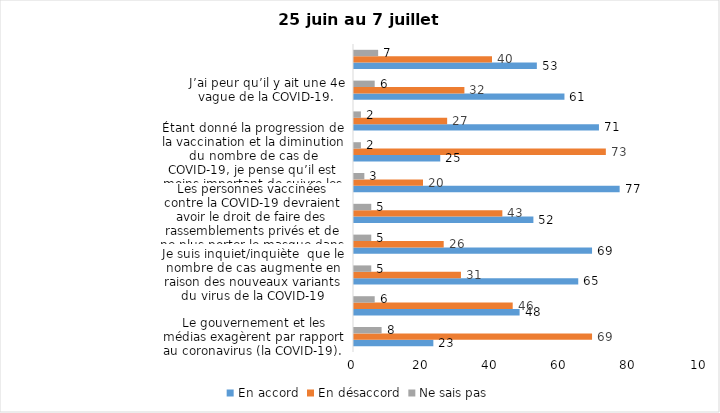
| Category | En accord | En désaccord | Ne sais pas |
|---|---|---|---|
| Le gouvernement et les médias exagèrent par rapport au coronavirus (la COVID-19). | 23 | 69 | 8 |
| J’ai peur que le système de santé soit débordé par les cas de COVID-19 suite au "déconfinement" | 48 | 46 | 6 |
| Je suis inquiet/inquiète  que le nombre de cas augmente en raison des nouveaux variants du virus de la COVID-19 | 65 | 31 | 5 |
| La frontière entre le Canada et les États-Unis devrait être fermée au moins jusqu’en septembre 2021 | 69 | 26 | 5 |
| Les personnes vaccinées contre la COVID-19 devraient avoir le droit de faire des rassemblements privés et de ne plus porter le masque dans les lieux publics. | 52 | 43 | 5 |
| Je suis favorable au passeport vaccinal qui permettrait l'accès à certains lieux ou activités aux personnes vaccinées. | 77 | 20 | 3 |
| Étant donné la progression de la vaccination et la diminution du nombre de cas de COVID-19, je pense qu’il est moins important de suivre les mesures de prévention. | 25 | 73 | 2 |
| Malgré la levée des mesures de confinement, je préfère limiter mes contacts avec d’autres personnes (par ex., en évitant les activités sociales et de groupes) | 71 | 27 | 2 |
| J’ai peur qu’il y ait une 4e vague de la COVID-19. | 61 | 32 | 6 |
| Dans les régions en zone verte, le risque d’attraper la COVID-19 est minime. | 53 | 40 | 7 |